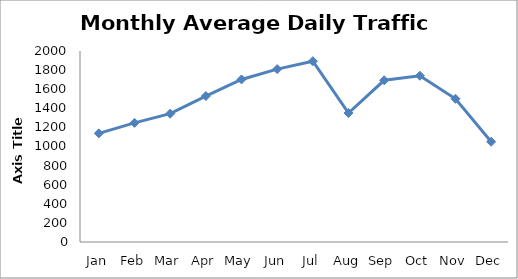
| Category | Series 0 |
|---|---|
| Jan | 1137.75 |
| Feb | 1247.25 |
| Mar | 1343.75 |
| Apr | 1528.25 |
| May | 1702 |
| Jun | 1810.5 |
| Jul | 1893.5 |
| Aug | 1350.25 |
| Sep | 1693.5 |
| Oct | 1740.75 |
| Nov | 1499.5 |
| Dec | 1049.75 |